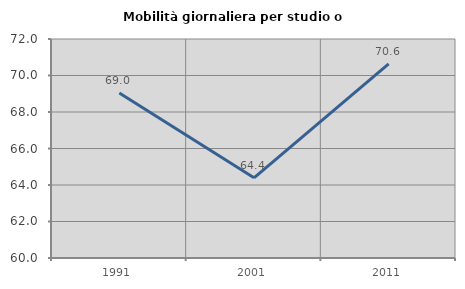
| Category | Mobilità giornaliera per studio o lavoro |
|---|---|
| 1991.0 | 69.036 |
| 2001.0 | 64.394 |
| 2011.0 | 70.633 |